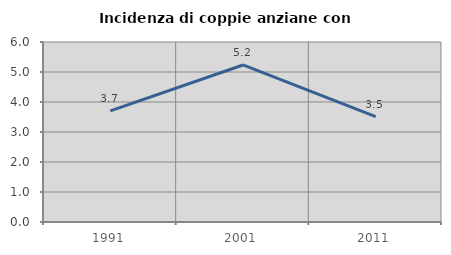
| Category | Incidenza di coppie anziane con figli |
|---|---|
| 1991.0 | 3.704 |
| 2001.0 | 5.234 |
| 2011.0 | 3.513 |